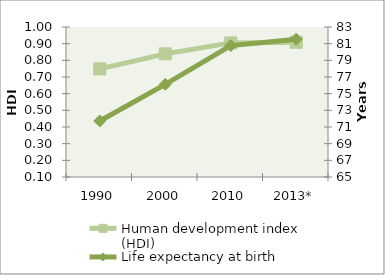
| Category | Human development index (HDI) |
|---|---|
| 1990 | 0.749 |
| 2000 | 0.839 |
| 2010 | 0.905 |
| 2013* | 0.909 |